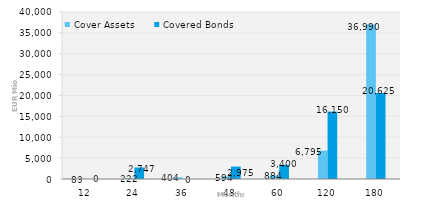
| Category | Cover Assets | Covered Bonds |
|---|---|---|
| 12.0 | 83.397 | 0 |
| 24.0 | 221.851 | 2747 |
| 36.0 | 404.446 | 0 |
| 48.0 | 594.069 | 2975 |
| 60.0 | 883.56 | 3400 |
| 120.0 | 6794.581 | 16150 |
| 180.0 | 36990.302 | 20625 |